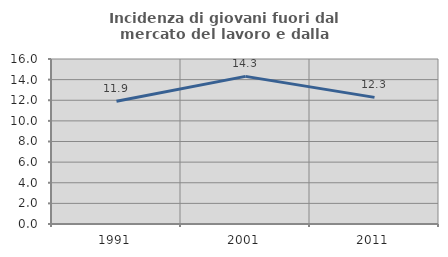
| Category | Incidenza di giovani fuori dal mercato del lavoro e dalla formazione  |
|---|---|
| 1991.0 | 11.895 |
| 2001.0 | 14.317 |
| 2011.0 | 12.28 |